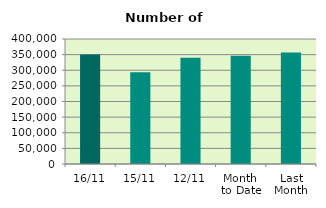
| Category | Series 0 |
|---|---|
| 16/11 | 350538 |
| 15/11 | 293746 |
| 12/11 | 339756 |
| Month 
to Date | 346348.167 |
| Last
Month | 357160.667 |